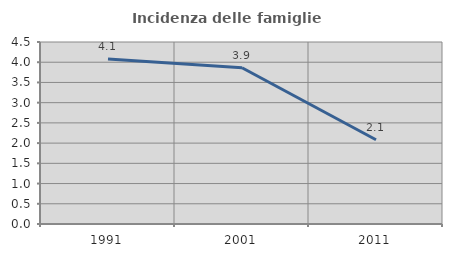
| Category | Incidenza delle famiglie numerose |
|---|---|
| 1991.0 | 4.082 |
| 2001.0 | 3.863 |
| 2011.0 | 2.083 |